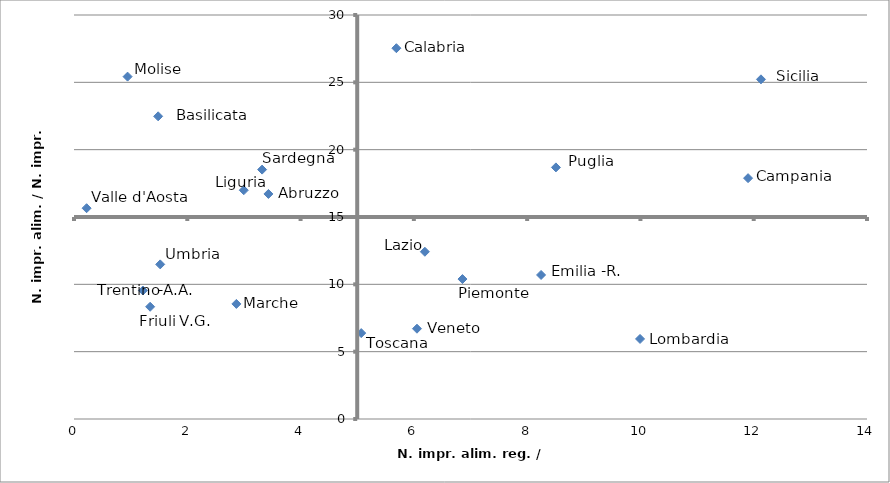
| Category | alim / man |
|---|---|
| 6.858205115437601 | 10.392 |
| 0.22241033046191638 | 15.654 |
| 9.993526863516406 | 5.945 |
| 2.997560125479261 | 16.99 |
| 1.2166177031983934 | 9.542 |
| 6.054872280037843 | 6.704 |
| 1.3444206542847184 | 8.335 |
| 8.245780012946273 | 10.696 |
| 5.070623578814586 | 6.38 |
| 1.5220169629371443 | 11.481 |
| 2.866437617221863 | 8.547 |
| 6.194293681222924 | 12.419 |
| 3.4324221148898735 | 16.711 |
| 0.9460737937559129 | 25.424 |
| 11.900612458298063 | 17.884 |
| 8.50802502946107 | 18.683 |
| 1.485501834055337 | 22.476 |
| 5.691380769805308 | 27.536 |
| 12.12800212451659 | 25.223 |
| 3.3212169496589157 | 18.519 |